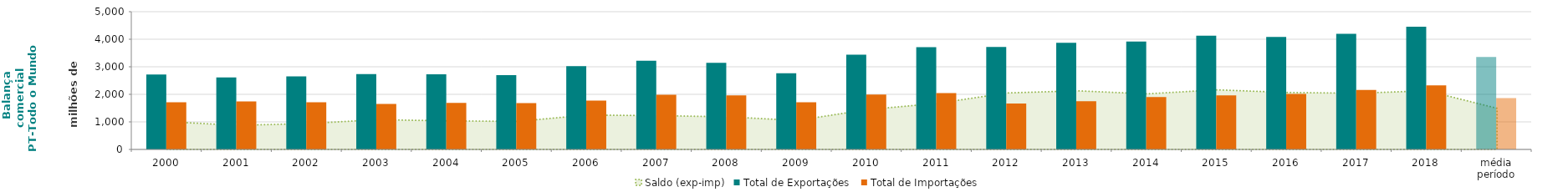
| Category | Total de Exportações  | Total de Importações  |
|---|---|---|
| 2000 | 2719.364 | 1711.327 |
| 2001 | 2613.741 | 1739.129 |
| 2002 | 2651.317 | 1715.256 |
| 2003 | 2732.206 | 1651.964 |
| 2004 | 2729.619 | 1692.418 |
| 2005 | 2700.567 | 1683.361 |
| 2006 | 3023.368 | 1775.717 |
| 2007 | 3216.917 | 1988.444 |
| 2008 | 3143.269 | 1959.202 |
| 2009 | 2761.887 | 1710.724 |
| 2010 | 3437.789 | 1992.856 |
| 2011 | 3715.67 | 2045.075 |
| 2012 | 3718.236 | 1668.747 |
| 2013 | 3874.977 | 1747.165 |
| 2014 | 3915.819 | 1898.536 |
| 2015 | 4127.679 | 1964.291 |
| 2016 | 4080.579 | 2013.498 |
| 2017 | 4197.892 | 2159.026 |
| 2018 | 4455.22 | 2325.924 |
| média período | 3358.743 | 1865.403 |